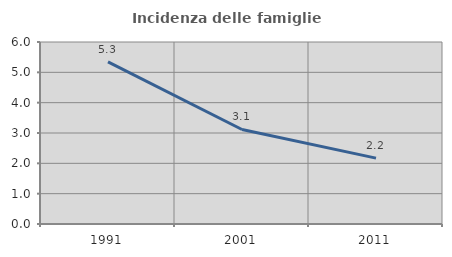
| Category | Incidenza delle famiglie numerose |
|---|---|
| 1991.0 | 5.348 |
| 2001.0 | 3.116 |
| 2011.0 | 2.171 |